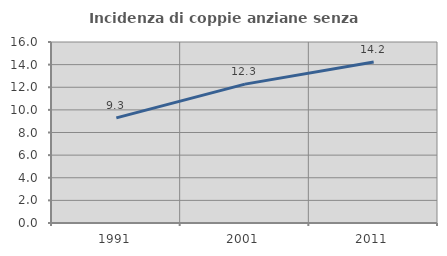
| Category | Incidenza di coppie anziane senza figli  |
|---|---|
| 1991.0 | 9.292 |
| 2001.0 | 12.277 |
| 2011.0 | 14.232 |